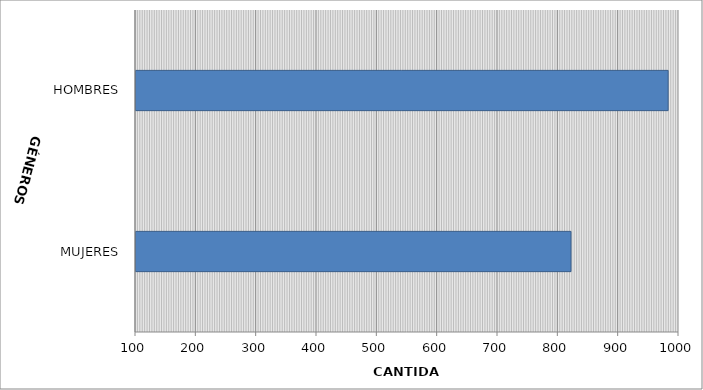
| Category | Series 0 |
|---|---|
| MUJERES | 821 |
| HOMBRES | 982 |